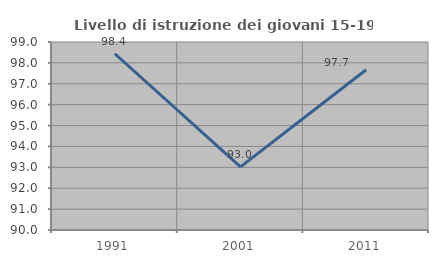
| Category | Livello di istruzione dei giovani 15-19 anni |
|---|---|
| 1991.0 | 98.438 |
| 2001.0 | 93.023 |
| 2011.0 | 97.674 |